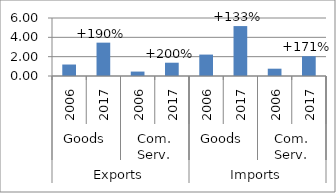
| Category | Trade flows |
|---|---|
| 0 | 1.188 |
| 1 | 3.45 |
| 2 | 0.458 |
| 3 | 1.375 |
| 4 | 2.216 |
| 5 | 5.164 |
| 6 | 0.756 |
| 7 | 2.048 |